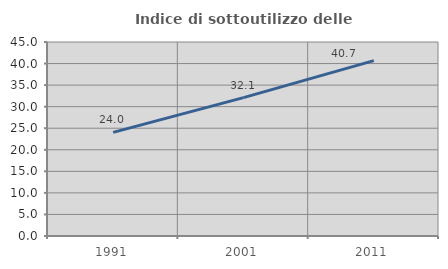
| Category | Indice di sottoutilizzo delle abitazioni  |
|---|---|
| 1991.0 | 24.045 |
| 2001.0 | 32.09 |
| 2011.0 | 40.669 |